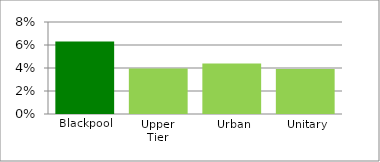
| Category | Series 1 |
|---|---|
| Blackpool | 0.063 |
| Upper Tier | 0.04 |
| Urban | 0.044 |
| Unitary | 0.039 |